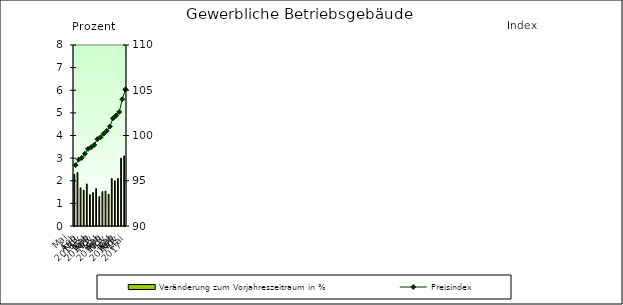
| Category | Veränderung zum Vorjahreszeitraum in % |
|---|---|
| 0 | 2.284 |
| 1 | 2.365 |
| 2 | 1.689 |
| 3 | 1.586 |
| 4 | 1.86 |
| 5 | 1.386 |
| 6 | 1.476 |
| 7 | 1.653 |
| 8 | 1.299 |
| 9 | 1.519 |
| 10 | 1.546 |
| 11 | 1.4 |
| 12 | 2.1 |
| 13 | 2 |
| 14 | 2.1 |
| 15 | 3 |
| 16 | 3.1 |